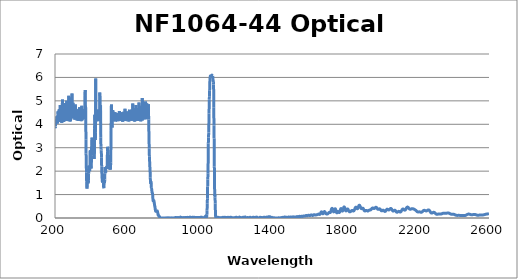
| Category | Optical Density |
|---|---|
| 2600.0 | 0.188 |
| 2599.0 | 0.186 |
| 2598.0 | 0.183 |
| 2597.0 | 0.181 |
| 2596.0 | 0.179 |
| 2595.0 | 0.178 |
| 2594.0 | 0.176 |
| 2593.0 | 0.175 |
| 2592.0 | 0.173 |
| 2591.0 | 0.172 |
| 2590.0 | 0.17 |
| 2589.0 | 0.169 |
| 2588.0 | 0.167 |
| 2587.0 | 0.166 |
| 2586.0 | 0.165 |
| 2585.0 | 0.164 |
| 2584.0 | 0.163 |
| 2583.0 | 0.162 |
| 2582.0 | 0.16 |
| 2581.0 | 0.158 |
| 2580.0 | 0.156 |
| 2579.0 | 0.154 |
| 2578.0 | 0.152 |
| 2577.0 | 0.15 |
| 2576.0 | 0.148 |
| 2575.0 | 0.145 |
| 2574.0 | 0.143 |
| 2573.0 | 0.141 |
| 2572.0 | 0.139 |
| 2571.0 | 0.137 |
| 2570.0 | 0.135 |
| 2569.0 | 0.133 |
| 2568.0 | 0.131 |
| 2567.0 | 0.13 |
| 2566.0 | 0.129 |
| 2565.0 | 0.128 |
| 2564.0 | 0.127 |
| 2563.0 | 0.127 |
| 2562.0 | 0.127 |
| 2561.0 | 0.127 |
| 2560.0 | 0.127 |
| 2559.0 | 0.127 |
| 2558.0 | 0.127 |
| 2557.0 | 0.127 |
| 2556.0 | 0.128 |
| 2555.0 | 0.128 |
| 2554.0 | 0.128 |
| 2553.0 | 0.128 |
| 2552.0 | 0.128 |
| 2551.0 | 0.128 |
| 2550.0 | 0.127 |
| 2549.0 | 0.127 |
| 2548.0 | 0.126 |
| 2547.0 | 0.124 |
| 2546.0 | 0.123 |
| 2545.0 | 0.122 |
| 2544.0 | 0.121 |
| 2543.0 | 0.12 |
| 2542.0 | 0.119 |
| 2541.0 | 0.118 |
| 2540.0 | 0.117 |
| 2539.0 | 0.117 |
| 2538.0 | 0.118 |
| 2537.0 | 0.118 |
| 2536.0 | 0.119 |
| 2535.0 | 0.12 |
| 2534.0 | 0.122 |
| 2533.0 | 0.124 |
| 2532.0 | 0.126 |
| 2531.0 | 0.128 |
| 2530.0 | 0.131 |
| 2529.0 | 0.134 |
| 2528.0 | 0.136 |
| 2527.0 | 0.139 |
| 2526.0 | 0.141 |
| 2525.0 | 0.144 |
| 2524.0 | 0.146 |
| 2523.0 | 0.148 |
| 2522.0 | 0.15 |
| 2521.0 | 0.151 |
| 2520.0 | 0.152 |
| 2519.0 | 0.153 |
| 2518.0 | 0.153 |
| 2517.0 | 0.153 |
| 2516.0 | 0.152 |
| 2515.0 | 0.151 |
| 2514.0 | 0.149 |
| 2513.0 | 0.148 |
| 2512.0 | 0.146 |
| 2511.0 | 0.144 |
| 2510.0 | 0.143 |
| 2509.0 | 0.141 |
| 2508.0 | 0.14 |
| 2507.0 | 0.139 |
| 2506.0 | 0.138 |
| 2505.0 | 0.137 |
| 2504.0 | 0.138 |
| 2503.0 | 0.138 |
| 2502.0 | 0.139 |
| 2501.0 | 0.141 |
| 2500.0 | 0.143 |
| 2499.0 | 0.145 |
| 2498.0 | 0.147 |
| 2497.0 | 0.15 |
| 2496.0 | 0.153 |
| 2495.0 | 0.155 |
| 2494.0 | 0.158 |
| 2493.0 | 0.161 |
| 2492.0 | 0.163 |
| 2491.0 | 0.165 |
| 2490.0 | 0.166 |
| 2489.0 | 0.167 |
| 2488.0 | 0.167 |
| 2487.0 | 0.167 |
| 2486.0 | 0.167 |
| 2485.0 | 0.165 |
| 2484.0 | 0.163 |
| 2483.0 | 0.161 |
| 2482.0 | 0.158 |
| 2481.0 | 0.155 |
| 2480.0 | 0.151 |
| 2479.0 | 0.147 |
| 2478.0 | 0.143 |
| 2477.0 | 0.139 |
| 2476.0 | 0.134 |
| 2475.0 | 0.13 |
| 2474.0 | 0.126 |
| 2473.0 | 0.122 |
| 2472.0 | 0.119 |
| 2471.0 | 0.115 |
| 2470.0 | 0.112 |
| 2469.0 | 0.11 |
| 2468.0 | 0.108 |
| 2467.0 | 0.106 |
| 2466.0 | 0.105 |
| 2465.0 | 0.104 |
| 2464.0 | 0.104 |
| 2463.0 | 0.103 |
| 2462.0 | 0.103 |
| 2461.0 | 0.103 |
| 2460.0 | 0.103 |
| 2459.0 | 0.103 |
| 2458.0 | 0.103 |
| 2457.0 | 0.103 |
| 2456.0 | 0.104 |
| 2455.0 | 0.104 |
| 2454.0 | 0.104 |
| 2453.0 | 0.104 |
| 2452.0 | 0.104 |
| 2451.0 | 0.104 |
| 2450.0 | 0.104 |
| 2449.0 | 0.104 |
| 2448.0 | 0.104 |
| 2447.0 | 0.105 |
| 2446.0 | 0.105 |
| 2445.0 | 0.106 |
| 2444.0 | 0.106 |
| 2443.0 | 0.107 |
| 2442.0 | 0.108 |
| 2441.0 | 0.108 |
| 2440.0 | 0.109 |
| 2439.0 | 0.11 |
| 2438.0 | 0.111 |
| 2437.0 | 0.112 |
| 2436.0 | 0.113 |
| 2435.0 | 0.113 |
| 2434.0 | 0.113 |
| 2433.0 | 0.114 |
| 2432.0 | 0.114 |
| 2431.0 | 0.113 |
| 2430.0 | 0.113 |
| 2429.0 | 0.113 |
| 2428.0 | 0.112 |
| 2427.0 | 0.112 |
| 2426.0 | 0.111 |
| 2425.0 | 0.111 |
| 2424.0 | 0.111 |
| 2423.0 | 0.111 |
| 2422.0 | 0.112 |
| 2421.0 | 0.113 |
| 2420.0 | 0.114 |
| 2419.0 | 0.116 |
| 2418.0 | 0.118 |
| 2417.0 | 0.12 |
| 2416.0 | 0.123 |
| 2415.0 | 0.126 |
| 2414.0 | 0.13 |
| 2413.0 | 0.133 |
| 2412.0 | 0.137 |
| 2411.0 | 0.14 |
| 2410.0 | 0.144 |
| 2409.0 | 0.147 |
| 2408.0 | 0.15 |
| 2407.0 | 0.153 |
| 2406.0 | 0.156 |
| 2405.0 | 0.158 |
| 2404.0 | 0.159 |
| 2403.0 | 0.161 |
| 2402.0 | 0.162 |
| 2401.0 | 0.162 |
| 2400.0 | 0.162 |
| 2399.0 | 0.162 |
| 2398.0 | 0.161 |
| 2397.0 | 0.16 |
| 2396.0 | 0.16 |
| 2395.0 | 0.16 |
| 2394.0 | 0.16 |
| 2393.0 | 0.16 |
| 2392.0 | 0.161 |
| 2391.0 | 0.162 |
| 2390.0 | 0.164 |
| 2389.0 | 0.166 |
| 2388.0 | 0.169 |
| 2387.0 | 0.172 |
| 2386.0 | 0.176 |
| 2385.0 | 0.18 |
| 2384.0 | 0.184 |
| 2383.0 | 0.189 |
| 2382.0 | 0.193 |
| 2381.0 | 0.197 |
| 2380.0 | 0.202 |
| 2379.0 | 0.205 |
| 2378.0 | 0.209 |
| 2377.0 | 0.211 |
| 2376.0 | 0.214 |
| 2375.0 | 0.215 |
| 2374.0 | 0.216 |
| 2373.0 | 0.216 |
| 2372.0 | 0.216 |
| 2371.0 | 0.215 |
| 2370.0 | 0.213 |
| 2369.0 | 0.212 |
| 2368.0 | 0.21 |
| 2367.0 | 0.208 |
| 2366.0 | 0.206 |
| 2365.0 | 0.203 |
| 2364.0 | 0.202 |
| 2363.0 | 0.2 |
| 2362.0 | 0.199 |
| 2361.0 | 0.198 |
| 2360.0 | 0.198 |
| 2359.0 | 0.198 |
| 2358.0 | 0.198 |
| 2357.0 | 0.198 |
| 2356.0 | 0.199 |
| 2355.0 | 0.201 |
| 2354.0 | 0.202 |
| 2353.0 | 0.203 |
| 2352.0 | 0.204 |
| 2351.0 | 0.205 |
| 2350.0 | 0.205 |
| 2349.0 | 0.205 |
| 2348.0 | 0.205 |
| 2347.0 | 0.203 |
| 2346.0 | 0.202 |
| 2345.0 | 0.199 |
| 2344.0 | 0.197 |
| 2343.0 | 0.193 |
| 2342.0 | 0.19 |
| 2341.0 | 0.187 |
| 2340.0 | 0.183 |
| 2339.0 | 0.18 |
| 2338.0 | 0.177 |
| 2337.0 | 0.174 |
| 2336.0 | 0.172 |
| 2335.0 | 0.17 |
| 2334.0 | 0.168 |
| 2333.0 | 0.168 |
| 2332.0 | 0.167 |
| 2331.0 | 0.168 |
| 2330.0 | 0.168 |
| 2329.0 | 0.169 |
| 2328.0 | 0.17 |
| 2327.0 | 0.171 |
| 2326.0 | 0.172 |
| 2325.0 | 0.173 |
| 2324.0 | 0.173 |
| 2323.0 | 0.173 |
| 2322.0 | 0.173 |
| 2321.0 | 0.172 |
| 2320.0 | 0.17 |
| 2319.0 | 0.168 |
| 2318.0 | 0.166 |
| 2317.0 | 0.164 |
| 2316.0 | 0.162 |
| 2315.0 | 0.16 |
| 2314.0 | 0.158 |
| 2313.0 | 0.157 |
| 2312.0 | 0.157 |
| 2311.0 | 0.157 |
| 2310.0 | 0.159 |
| 2309.0 | 0.162 |
| 2308.0 | 0.167 |
| 2307.0 | 0.172 |
| 2306.0 | 0.178 |
| 2305.0 | 0.185 |
| 2304.0 | 0.192 |
| 2303.0 | 0.2 |
| 2302.0 | 0.208 |
| 2301.0 | 0.216 |
| 2300.0 | 0.223 |
| 2299.0 | 0.23 |
| 2298.0 | 0.235 |
| 2297.0 | 0.239 |
| 2296.0 | 0.241 |
| 2295.0 | 0.243 |
| 2294.0 | 0.243 |
| 2293.0 | 0.242 |
| 2292.0 | 0.24 |
| 2291.0 | 0.236 |
| 2290.0 | 0.232 |
| 2289.0 | 0.228 |
| 2288.0 | 0.223 |
| 2287.0 | 0.218 |
| 2286.0 | 0.215 |
| 2285.0 | 0.212 |
| 2284.0 | 0.21 |
| 2283.0 | 0.21 |
| 2282.0 | 0.211 |
| 2281.0 | 0.215 |
| 2280.0 | 0.22 |
| 2279.0 | 0.227 |
| 2278.0 | 0.235 |
| 2277.0 | 0.245 |
| 2276.0 | 0.256 |
| 2275.0 | 0.268 |
| 2274.0 | 0.281 |
| 2273.0 | 0.293 |
| 2272.0 | 0.304 |
| 2271.0 | 0.315 |
| 2270.0 | 0.324 |
| 2269.0 | 0.331 |
| 2268.0 | 0.337 |
| 2267.0 | 0.341 |
| 2266.0 | 0.344 |
| 2265.0 | 0.345 |
| 2264.0 | 0.344 |
| 2263.0 | 0.341 |
| 2262.0 | 0.338 |
| 2261.0 | 0.333 |
| 2260.0 | 0.329 |
| 2259.0 | 0.323 |
| 2258.0 | 0.318 |
| 2257.0 | 0.313 |
| 2256.0 | 0.309 |
| 2255.0 | 0.306 |
| 2254.0 | 0.304 |
| 2253.0 | 0.302 |
| 2252.0 | 0.303 |
| 2251.0 | 0.304 |
| 2250.0 | 0.306 |
| 2249.0 | 0.309 |
| 2248.0 | 0.312 |
| 2247.0 | 0.316 |
| 2246.0 | 0.319 |
| 2245.0 | 0.323 |
| 2244.0 | 0.325 |
| 2243.0 | 0.327 |
| 2242.0 | 0.328 |
| 2241.0 | 0.328 |
| 2240.0 | 0.326 |
| 2239.0 | 0.323 |
| 2238.0 | 0.319 |
| 2237.0 | 0.313 |
| 2236.0 | 0.306 |
| 2235.0 | 0.298 |
| 2234.0 | 0.291 |
| 2233.0 | 0.283 |
| 2232.0 | 0.275 |
| 2231.0 | 0.267 |
| 2230.0 | 0.261 |
| 2229.0 | 0.256 |
| 2228.0 | 0.251 |
| 2227.0 | 0.248 |
| 2226.0 | 0.246 |
| 2225.0 | 0.245 |
| 2224.0 | 0.246 |
| 2223.0 | 0.247 |
| 2222.0 | 0.249 |
| 2221.0 | 0.252 |
| 2220.0 | 0.254 |
| 2219.0 | 0.257 |
| 2218.0 | 0.259 |
| 2217.0 | 0.261 |
| 2216.0 | 0.262 |
| 2215.0 | 0.262 |
| 2214.0 | 0.263 |
| 2213.0 | 0.262 |
| 2212.0 | 0.262 |
| 2211.0 | 0.261 |
| 2210.0 | 0.26 |
| 2209.0 | 0.259 |
| 2208.0 | 0.259 |
| 2207.0 | 0.26 |
| 2206.0 | 0.261 |
| 2205.0 | 0.263 |
| 2204.0 | 0.266 |
| 2203.0 | 0.271 |
| 2202.0 | 0.276 |
| 2201.0 | 0.282 |
| 2200.0 | 0.289 |
| 2199.0 | 0.296 |
| 2198.0 | 0.303 |
| 2197.0 | 0.311 |
| 2196.0 | 0.318 |
| 2195.0 | 0.326 |
| 2194.0 | 0.333 |
| 2193.0 | 0.339 |
| 2192.0 | 0.345 |
| 2191.0 | 0.35 |
| 2190.0 | 0.356 |
| 2189.0 | 0.36 |
| 2188.0 | 0.365 |
| 2187.0 | 0.369 |
| 2186.0 | 0.373 |
| 2185.0 | 0.376 |
| 2184.0 | 0.38 |
| 2183.0 | 0.383 |
| 2182.0 | 0.386 |
| 2181.0 | 0.389 |
| 2180.0 | 0.392 |
| 2179.0 | 0.394 |
| 2178.0 | 0.396 |
| 2177.0 | 0.397 |
| 2176.0 | 0.398 |
| 2175.0 | 0.397 |
| 2174.0 | 0.397 |
| 2173.0 | 0.395 |
| 2172.0 | 0.393 |
| 2171.0 | 0.39 |
| 2170.0 | 0.387 |
| 2169.0 | 0.383 |
| 2168.0 | 0.38 |
| 2167.0 | 0.377 |
| 2166.0 | 0.375 |
| 2165.0 | 0.373 |
| 2164.0 | 0.373 |
| 2163.0 | 0.374 |
| 2162.0 | 0.377 |
| 2161.0 | 0.382 |
| 2160.0 | 0.388 |
| 2159.0 | 0.395 |
| 2158.0 | 0.404 |
| 2157.0 | 0.414 |
| 2156.0 | 0.424 |
| 2155.0 | 0.434 |
| 2154.0 | 0.443 |
| 2153.0 | 0.451 |
| 2152.0 | 0.458 |
| 2151.0 | 0.463 |
| 2150.0 | 0.466 |
| 2149.0 | 0.466 |
| 2148.0 | 0.464 |
| 2147.0 | 0.459 |
| 2146.0 | 0.451 |
| 2145.0 | 0.442 |
| 2144.0 | 0.431 |
| 2143.0 | 0.418 |
| 2142.0 | 0.404 |
| 2141.0 | 0.39 |
| 2140.0 | 0.375 |
| 2139.0 | 0.363 |
| 2138.0 | 0.353 |
| 2137.0 | 0.344 |
| 2136.0 | 0.338 |
| 2135.0 | 0.335 |
| 2134.0 | 0.334 |
| 2133.0 | 0.336 |
| 2132.0 | 0.341 |
| 2131.0 | 0.347 |
| 2130.0 | 0.354 |
| 2129.0 | 0.362 |
| 2128.0 | 0.369 |
| 2127.0 | 0.376 |
| 2126.0 | 0.381 |
| 2125.0 | 0.384 |
| 2124.0 | 0.385 |
| 2123.0 | 0.383 |
| 2122.0 | 0.378 |
| 2121.0 | 0.371 |
| 2120.0 | 0.362 |
| 2119.0 | 0.35 |
| 2118.0 | 0.337 |
| 2117.0 | 0.322 |
| 2116.0 | 0.308 |
| 2115.0 | 0.294 |
| 2114.0 | 0.281 |
| 2113.0 | 0.27 |
| 2112.0 | 0.262 |
| 2111.0 | 0.257 |
| 2110.0 | 0.254 |
| 2109.0 | 0.255 |
| 2108.0 | 0.257 |
| 2107.0 | 0.261 |
| 2106.0 | 0.266 |
| 2105.0 | 0.272 |
| 2104.0 | 0.277 |
| 2103.0 | 0.28 |
| 2102.0 | 0.283 |
| 2101.0 | 0.284 |
| 2100.0 | 0.283 |
| 2099.0 | 0.28 |
| 2098.0 | 0.275 |
| 2097.0 | 0.27 |
| 2096.0 | 0.264 |
| 2095.0 | 0.258 |
| 2094.0 | 0.253 |
| 2093.0 | 0.249 |
| 2092.0 | 0.247 |
| 2091.0 | 0.246 |
| 2090.0 | 0.249 |
| 2089.0 | 0.253 |
| 2088.0 | 0.26 |
| 2087.0 | 0.268 |
| 2086.0 | 0.278 |
| 2085.0 | 0.289 |
| 2084.0 | 0.299 |
| 2083.0 | 0.309 |
| 2082.0 | 0.318 |
| 2081.0 | 0.324 |
| 2080.0 | 0.329 |
| 2079.0 | 0.331 |
| 2078.0 | 0.33 |
| 2077.0 | 0.328 |
| 2076.0 | 0.324 |
| 2075.0 | 0.318 |
| 2074.0 | 0.311 |
| 2073.0 | 0.305 |
| 2072.0 | 0.3 |
| 2071.0 | 0.296 |
| 2070.0 | 0.296 |
| 2069.0 | 0.298 |
| 2068.0 | 0.303 |
| 2067.0 | 0.311 |
| 2066.0 | 0.321 |
| 2065.0 | 0.333 |
| 2064.0 | 0.346 |
| 2063.0 | 0.36 |
| 2062.0 | 0.373 |
| 2061.0 | 0.384 |
| 2060.0 | 0.394 |
| 2059.0 | 0.401 |
| 2058.0 | 0.406 |
| 2057.0 | 0.407 |
| 2056.0 | 0.406 |
| 2055.0 | 0.403 |
| 2054.0 | 0.397 |
| 2053.0 | 0.39 |
| 2052.0 | 0.381 |
| 2051.0 | 0.373 |
| 2050.0 | 0.364 |
| 2049.0 | 0.356 |
| 2048.0 | 0.349 |
| 2047.0 | 0.345 |
| 2046.0 | 0.343 |
| 2045.0 | 0.344 |
| 2044.0 | 0.346 |
| 2043.0 | 0.351 |
| 2042.0 | 0.356 |
| 2041.0 | 0.362 |
| 2040.0 | 0.368 |
| 2039.0 | 0.373 |
| 2038.0 | 0.375 |
| 2037.0 | 0.376 |
| 2036.0 | 0.374 |
| 2035.0 | 0.37 |
| 2034.0 | 0.362 |
| 2033.0 | 0.353 |
| 2032.0 | 0.342 |
| 2031.0 | 0.33 |
| 2030.0 | 0.317 |
| 2029.0 | 0.305 |
| 2028.0 | 0.295 |
| 2027.0 | 0.288 |
| 2026.0 | 0.283 |
| 2025.0 | 0.281 |
| 2024.0 | 0.282 |
| 2023.0 | 0.286 |
| 2022.0 | 0.293 |
| 2021.0 | 0.3 |
| 2020.0 | 0.309 |
| 2019.0 | 0.316 |
| 2018.0 | 0.323 |
| 2017.0 | 0.329 |
| 2016.0 | 0.332 |
| 2015.0 | 0.333 |
| 2014.0 | 0.332 |
| 2013.0 | 0.329 |
| 2012.0 | 0.325 |
| 2011.0 | 0.319 |
| 2010.0 | 0.314 |
| 2009.0 | 0.31 |
| 2008.0 | 0.306 |
| 2007.0 | 0.305 |
| 2006.0 | 0.306 |
| 2005.0 | 0.309 |
| 2004.0 | 0.315 |
| 2003.0 | 0.323 |
| 2002.0 | 0.334 |
| 2001.0 | 0.345 |
| 2000.0 | 0.356 |
| 1999.0 | 0.367 |
| 1998.0 | 0.376 |
| 1997.0 | 0.384 |
| 1996.0 | 0.389 |
| 1995.0 | 0.391 |
| 1994.0 | 0.391 |
| 1993.0 | 0.389 |
| 1992.0 | 0.385 |
| 1991.0 | 0.38 |
| 1990.0 | 0.376 |
| 1989.0 | 0.372 |
| 1988.0 | 0.369 |
| 1987.0 | 0.369 |
| 1986.0 | 0.371 |
| 1985.0 | 0.376 |
| 1984.0 | 0.383 |
| 1983.0 | 0.393 |
| 1982.0 | 0.404 |
| 1981.0 | 0.415 |
| 1980.0 | 0.426 |
| 1979.0 | 0.436 |
| 1978.0 | 0.445 |
| 1977.0 | 0.452 |
| 1976.0 | 0.456 |
| 1975.0 | 0.457 |
| 1974.0 | 0.456 |
| 1973.0 | 0.453 |
| 1972.0 | 0.447 |
| 1971.0 | 0.441 |
| 1970.0 | 0.434 |
| 1969.0 | 0.425 |
| 1968.0 | 0.418 |
| 1967.0 | 0.412 |
| 1966.0 | 0.408 |
| 1965.0 | 0.406 |
| 1964.0 | 0.405 |
| 1963.0 | 0.408 |
| 1962.0 | 0.411 |
| 1961.0 | 0.415 |
| 1960.0 | 0.419 |
| 1959.0 | 0.423 |
| 1958.0 | 0.426 |
| 1957.0 | 0.428 |
| 1956.0 | 0.427 |
| 1955.0 | 0.424 |
| 1954.0 | 0.419 |
| 1953.0 | 0.412 |
| 1952.0 | 0.403 |
| 1951.0 | 0.393 |
| 1950.0 | 0.383 |
| 1949.0 | 0.373 |
| 1948.0 | 0.364 |
| 1947.0 | 0.356 |
| 1946.0 | 0.35 |
| 1945.0 | 0.346 |
| 1944.0 | 0.343 |
| 1943.0 | 0.342 |
| 1942.0 | 0.341 |
| 1941.0 | 0.34 |
| 1940.0 | 0.34 |
| 1939.0 | 0.339 |
| 1938.0 | 0.336 |
| 1937.0 | 0.333 |
| 1936.0 | 0.328 |
| 1935.0 | 0.323 |
| 1934.0 | 0.317 |
| 1933.0 | 0.311 |
| 1932.0 | 0.306 |
| 1931.0 | 0.302 |
| 1930.0 | 0.3 |
| 1929.0 | 0.3 |
| 1928.0 | 0.301 |
| 1927.0 | 0.304 |
| 1926.0 | 0.308 |
| 1925.0 | 0.312 |
| 1924.0 | 0.316 |
| 1923.0 | 0.319 |
| 1922.0 | 0.322 |
| 1921.0 | 0.323 |
| 1920.0 | 0.323 |
| 1919.0 | 0.32 |
| 1918.0 | 0.316 |
| 1917.0 | 0.311 |
| 1916.0 | 0.305 |
| 1915.0 | 0.301 |
| 1914.0 | 0.3 |
| 1913.0 | 0.302 |
| 1912.0 | 0.307 |
| 1911.0 | 0.314 |
| 1910.0 | 0.323 |
| 1909.0 | 0.334 |
| 1908.0 | 0.347 |
| 1907.0 | 0.364 |
| 1906.0 | 0.382 |
| 1905.0 | 0.398 |
| 1904.0 | 0.409 |
| 1903.0 | 0.416 |
| 1902.0 | 0.419 |
| 1901.0 | 0.42 |
| 1900.0 | 0.417 |
| 1899.0 | 0.414 |
| 1898.0 | 0.41 |
| 1897.0 | 0.405 |
| 1896.0 | 0.401 |
| 1895.0 | 0.399 |
| 1894.0 | 0.401 |
| 1893.0 | 0.408 |
| 1892.0 | 0.421 |
| 1891.0 | 0.437 |
| 1890.0 | 0.454 |
| 1889.0 | 0.473 |
| 1888.0 | 0.49 |
| 1887.0 | 0.506 |
| 1886.0 | 0.52 |
| 1885.0 | 0.533 |
| 1884.0 | 0.542 |
| 1883.0 | 0.545 |
| 1882.0 | 0.542 |
| 1881.0 | 0.533 |
| 1880.0 | 0.519 |
| 1879.0 | 0.501 |
| 1878.0 | 0.479 |
| 1877.0 | 0.457 |
| 1876.0 | 0.437 |
| 1875.0 | 0.418 |
| 1874.0 | 0.404 |
| 1873.0 | 0.397 |
| 1872.0 | 0.394 |
| 1871.0 | 0.397 |
| 1870.0 | 0.407 |
| 1869.0 | 0.419 |
| 1868.0 | 0.433 |
| 1867.0 | 0.444 |
| 1866.0 | 0.454 |
| 1865.0 | 0.46 |
| 1864.0 | 0.462 |
| 1863.0 | 0.461 |
| 1862.0 | 0.455 |
| 1861.0 | 0.444 |
| 1860.0 | 0.43 |
| 1859.0 | 0.411 |
| 1858.0 | 0.392 |
| 1857.0 | 0.372 |
| 1856.0 | 0.352 |
| 1855.0 | 0.335 |
| 1854.0 | 0.32 |
| 1853.0 | 0.31 |
| 1852.0 | 0.303 |
| 1851.0 | 0.3 |
| 1850.0 | 0.3 |
| 1849.0 | 0.303 |
| 1848.0 | 0.31 |
| 1847.0 | 0.317 |
| 1846.0 | 0.322 |
| 1845.0 | 0.324 |
| 1844.0 | 0.323 |
| 1843.0 | 0.321 |
| 1842.0 | 0.318 |
| 1841.0 | 0.317 |
| 1840.0 | 0.313 |
| 1839.0 | 0.307 |
| 1838.0 | 0.301 |
| 1837.0 | 0.293 |
| 1836.0 | 0.286 |
| 1835.0 | 0.28 |
| 1834.0 | 0.274 |
| 1833.0 | 0.269 |
| 1832.0 | 0.264 |
| 1831.0 | 0.262 |
| 1830.0 | 0.261 |
| 1829.0 | 0.263 |
| 1828.0 | 0.268 |
| 1827.0 | 0.277 |
| 1826.0 | 0.288 |
| 1825.0 | 0.3 |
| 1824.0 | 0.313 |
| 1823.0 | 0.327 |
| 1822.0 | 0.344 |
| 1821.0 | 0.361 |
| 1820.0 | 0.376 |
| 1819.0 | 0.384 |
| 1818.0 | 0.386 |
| 1817.0 | 0.384 |
| 1816.0 | 0.378 |
| 1815.0 | 0.368 |
| 1814.0 | 0.356 |
| 1813.0 | 0.342 |
| 1812.0 | 0.327 |
| 1811.0 | 0.314 |
| 1810.0 | 0.305 |
| 1809.0 | 0.303 |
| 1808.0 | 0.308 |
| 1807.0 | 0.32 |
| 1806.0 | 0.34 |
| 1805.0 | 0.364 |
| 1804.0 | 0.391 |
| 1803.0 | 0.417 |
| 1802.0 | 0.44 |
| 1801.0 | 0.458 |
| 1800.0 | 0.471 |
| 1799.0 | 0.475 |
| 1798.0 | 0.47 |
| 1797.0 | 0.457 |
| 1796.0 | 0.437 |
| 1795.0 | 0.411 |
| 1794.0 | 0.381 |
| 1793.0 | 0.352 |
| 1792.0 | 0.325 |
| 1791.0 | 0.305 |
| 1790.0 | 0.295 |
| 1789.0 | 0.294 |
| 1788.0 | 0.304 |
| 1787.0 | 0.32 |
| 1786.0 | 0.341 |
| 1785.0 | 0.362 |
| 1784.0 | 0.382 |
| 1783.0 | 0.395 |
| 1782.0 | 0.402 |
| 1781.0 | 0.4 |
| 1780.0 | 0.39 |
| 1779.0 | 0.374 |
| 1778.0 | 0.351 |
| 1777.0 | 0.326 |
| 1776.0 | 0.299 |
| 1775.0 | 0.273 |
| 1774.0 | 0.253 |
| 1773.0 | 0.239 |
| 1772.0 | 0.232 |
| 1771.0 | 0.232 |
| 1770.0 | 0.238 |
| 1769.0 | 0.248 |
| 1768.0 | 0.259 |
| 1767.0 | 0.268 |
| 1766.0 | 0.274 |
| 1765.0 | 0.275 |
| 1764.0 | 0.27 |
| 1763.0 | 0.259 |
| 1762.0 | 0.247 |
| 1761.0 | 0.234 |
| 1760.0 | 0.224 |
| 1759.0 | 0.22 |
| 1758.0 | 0.224 |
| 1757.0 | 0.237 |
| 1756.0 | 0.258 |
| 1755.0 | 0.285 |
| 1754.0 | 0.314 |
| 1753.0 | 0.342 |
| 1752.0 | 0.367 |
| 1751.0 | 0.384 |
| 1750.0 | 0.393 |
| 1749.0 | 0.393 |
| 1748.0 | 0.384 |
| 1747.0 | 0.368 |
| 1746.0 | 0.345 |
| 1745.0 | 0.32 |
| 1744.0 | 0.295 |
| 1743.0 | 0.275 |
| 1742.0 | 0.263 |
| 1741.0 | 0.26 |
| 1740.0 | 0.268 |
| 1739.0 | 0.285 |
| 1738.0 | 0.309 |
| 1737.0 | 0.335 |
| 1736.0 | 0.361 |
| 1735.0 | 0.383 |
| 1734.0 | 0.4 |
| 1733.0 | 0.41 |
| 1732.0 | 0.412 |
| 1731.0 | 0.406 |
| 1730.0 | 0.393 |
| 1729.0 | 0.373 |
| 1728.0 | 0.349 |
| 1727.0 | 0.323 |
| 1726.0 | 0.296 |
| 1725.0 | 0.273 |
| 1724.0 | 0.253 |
| 1723.0 | 0.24 |
| 1722.0 | 0.232 |
| 1721.0 | 0.229 |
| 1720.0 | 0.23 |
| 1719.0 | 0.233 |
| 1718.0 | 0.236 |
| 1717.0 | 0.238 |
| 1716.0 | 0.236 |
| 1715.0 | 0.232 |
| 1714.0 | 0.224 |
| 1713.0 | 0.216 |
| 1712.0 | 0.206 |
| 1711.0 | 0.197 |
| 1710.0 | 0.189 |
| 1709.0 | 0.182 |
| 1708.0 | 0.178 |
| 1707.0 | 0.175 |
| 1706.0 | 0.174 |
| 1705.0 | 0.173 |
| 1704.0 | 0.172 |
| 1703.0 | 0.172 |
| 1702.0 | 0.172 |
| 1701.0 | 0.173 |
| 1700.0 | 0.176 |
| 1699.0 | 0.182 |
| 1698.0 | 0.19 |
| 1697.0 | 0.201 |
| 1696.0 | 0.215 |
| 1695.0 | 0.229 |
| 1694.0 | 0.244 |
| 1693.0 | 0.257 |
| 1692.0 | 0.267 |
| 1691.0 | 0.273 |
| 1690.0 | 0.274 |
| 1689.0 | 0.27 |
| 1688.0 | 0.261 |
| 1687.0 | 0.247 |
| 1686.0 | 0.231 |
| 1685.0 | 0.214 |
| 1684.0 | 0.199 |
| 1683.0 | 0.188 |
| 1682.0 | 0.182 |
| 1681.0 | 0.183 |
| 1680.0 | 0.191 |
| 1679.0 | 0.203 |
| 1678.0 | 0.219 |
| 1677.0 | 0.235 |
| 1676.0 | 0.249 |
| 1675.0 | 0.258 |
| 1674.0 | 0.262 |
| 1673.0 | 0.261 |
| 1672.0 | 0.253 |
| 1671.0 | 0.241 |
| 1670.0 | 0.225 |
| 1669.0 | 0.207 |
| 1668.0 | 0.189 |
| 1667.0 | 0.175 |
| 1666.0 | 0.163 |
| 1665.0 | 0.156 |
| 1664.0 | 0.153 |
| 1663.0 | 0.154 |
| 1662.0 | 0.157 |
| 1661.0 | 0.16 |
| 1660.0 | 0.164 |
| 1659.0 | 0.166 |
| 1658.0 | 0.166 |
| 1657.0 | 0.165 |
| 1656.0 | 0.162 |
| 1655.0 | 0.158 |
| 1654.0 | 0.154 |
| 1653.0 | 0.15 |
| 1652.0 | 0.146 |
| 1651.0 | 0.143 |
| 1650.0 | 0.142 |
| 1649.0 | 0.14 |
| 1648.0 | 0.14 |
| 1647.0 | 0.138 |
| 1646.0 | 0.137 |
| 1645.0 | 0.135 |
| 1644.0 | 0.132 |
| 1643.0 | 0.129 |
| 1642.0 | 0.127 |
| 1641.0 | 0.125 |
| 1640.0 | 0.125 |
| 1639.0 | 0.126 |
| 1638.0 | 0.128 |
| 1637.0 | 0.132 |
| 1636.0 | 0.136 |
| 1635.0 | 0.14 |
| 1634.0 | 0.142 |
| 1633.0 | 0.143 |
| 1632.0 | 0.141 |
| 1631.0 | 0.138 |
| 1630.0 | 0.132 |
| 1629.0 | 0.126 |
| 1628.0 | 0.12 |
| 1627.0 | 0.114 |
| 1626.0 | 0.11 |
| 1625.0 | 0.108 |
| 1624.0 | 0.109 |
| 1623.0 | 0.112 |
| 1622.0 | 0.117 |
| 1621.0 | 0.122 |
| 1620.0 | 0.127 |
| 1619.0 | 0.131 |
| 1618.0 | 0.133 |
| 1617.0 | 0.133 |
| 1616.0 | 0.131 |
| 1615.0 | 0.127 |
| 1614.0 | 0.122 |
| 1613.0 | 0.116 |
| 1612.0 | 0.11 |
| 1611.0 | 0.106 |
| 1610.0 | 0.104 |
| 1609.0 | 0.103 |
| 1608.0 | 0.105 |
| 1607.0 | 0.108 |
| 1606.0 | 0.111 |
| 1605.0 | 0.115 |
| 1604.0 | 0.118 |
| 1603.0 | 0.12 |
| 1602.0 | 0.119 |
| 1601.0 | 0.117 |
| 1600.0 | 0.113 |
| 1599.0 | 0.107 |
| 1598.0 | 0.103 |
| 1597.0 | 0.098 |
| 1596.0 | 0.096 |
| 1595.0 | 0.095 |
| 1594.0 | 0.096 |
| 1593.0 | 0.099 |
| 1592.0 | 0.103 |
| 1591.0 | 0.106 |
| 1590.0 | 0.108 |
| 1589.0 | 0.108 |
| 1588.0 | 0.106 |
| 1587.0 | 0.103 |
| 1586.0 | 0.098 |
| 1585.0 | 0.093 |
| 1584.0 | 0.088 |
| 1583.0 | 0.085 |
| 1582.0 | 0.083 |
| 1581.0 | 0.083 |
| 1580.0 | 0.085 |
| 1579.0 | 0.087 |
| 1578.0 | 0.089 |
| 1577.0 | 0.09 |
| 1576.0 | 0.09 |
| 1575.0 | 0.088 |
| 1574.0 | 0.084 |
| 1573.0 | 0.08 |
| 1572.0 | 0.075 |
| 1571.0 | 0.071 |
| 1570.0 | 0.069 |
| 1569.0 | 0.068 |
| 1568.0 | 0.069 |
| 1567.0 | 0.071 |
| 1566.0 | 0.073 |
| 1565.0 | 0.076 |
| 1564.0 | 0.077 |
| 1563.0 | 0.076 |
| 1562.0 | 0.073 |
| 1561.0 | 0.069 |
| 1560.0 | 0.064 |
| 1559.0 | 0.059 |
| 1558.0 | 0.056 |
| 1557.0 | 0.055 |
| 1556.0 | 0.056 |
| 1555.0 | 0.06 |
| 1554.0 | 0.064 |
| 1553.0 | 0.068 |
| 1552.0 | 0.071 |
| 1551.0 | 0.071 |
| 1550.0 | 0.069 |
| 1549.0 | 0.065 |
| 1548.0 | 0.06 |
| 1547.0 | 0.054 |
| 1546.0 | 0.05 |
| 1545.0 | 0.047 |
| 1544.0 | 0.047 |
| 1543.0 | 0.049 |
| 1542.0 | 0.052 |
| 1541.0 | 0.056 |
| 1540.0 | 0.059 |
| 1539.0 | 0.06 |
| 1538.0 | 0.059 |
| 1537.0 | 0.056 |
| 1536.0 | 0.052 |
| 1535.0 | 0.047 |
| 1534.0 | 0.042 |
| 1533.0 | 0.039 |
| 1532.0 | 0.038 |
| 1531.0 | 0.039 |
| 1530.0 | 0.04 |
| 1529.0 | 0.042 |
| 1528.0 | 0.044 |
| 1527.0 | 0.044 |
| 1526.0 | 0.044 |
| 1525.0 | 0.042 |
| 1524.0 | 0.04 |
| 1523.0 | 0.038 |
| 1522.0 | 0.038 |
| 1521.0 | 0.039 |
| 1520.0 | 0.041 |
| 1519.0 | 0.045 |
| 1518.0 | 0.048 |
| 1517.0 | 0.05 |
| 1516.0 | 0.049 |
| 1515.0 | 0.046 |
| 1514.0 | 0.042 |
| 1513.0 | 0.035 |
| 1512.0 | 0.03 |
| 1511.0 | 0.027 |
| 1510.0 | 0.026 |
| 1509.0 | 0.029 |
| 1508.0 | 0.033 |
| 1507.0 | 0.039 |
| 1506.0 | 0.043 |
| 1505.0 | 0.045 |
| 1504.0 | 0.045 |
| 1503.0 | 0.041 |
| 1502.0 | 0.036 |
| 1501.0 | 0.03 |
| 1500.0 | 0.024 |
| 1499.0 | 0.021 |
| 1498.0 | 0.022 |
| 1497.0 | 0.025 |
| 1496.0 | 0.03 |
| 1495.0 | 0.036 |
| 1494.0 | 0.04 |
| 1493.0 | 0.042 |
| 1492.0 | 0.041 |
| 1491.0 | 0.037 |
| 1490.0 | 0.031 |
| 1489.0 | 0.025 |
| 1488.0 | 0.02 |
| 1487.0 | 0.017 |
| 1486.0 | 0.017 |
| 1485.0 | 0.021 |
| 1484.0 | 0.026 |
| 1483.0 | 0.031 |
| 1482.0 | 0.035 |
| 1481.0 | 0.035 |
| 1480.0 | 0.032 |
| 1479.0 | 0.027 |
| 1478.0 | 0.021 |
| 1477.0 | 0.016 |
| 1476.0 | 0.013 |
| 1475.0 | 0.015 |
| 1474.0 | 0.021 |
| 1473.0 | 0.028 |
| 1472.0 | 0.036 |
| 1471.0 | 0.043 |
| 1470.0 | 0.046 |
| 1469.0 | 0.045 |
| 1468.0 | 0.039 |
| 1467.0 | 0.031 |
| 1466.0 | 0.023 |
| 1465.0 | 0.016 |
| 1464.0 | 0.012 |
| 1463.0 | 0.01 |
| 1462.0 | 0.013 |
| 1461.0 | 0.016 |
| 1460.0 | 0.021 |
| 1459.0 | 0.025 |
| 1458.0 | 0.027 |
| 1457.0 | 0.027 |
| 1456.0 | 0.025 |
| 1455.0 | 0.021 |
| 1454.0 | 0.017 |
| 1453.0 | 0.014 |
| 1452.0 | 0.011 |
| 1451.0 | 0.01 |
| 1450.0 | 0.01 |
| 1449.0 | 0.01 |
| 1448.0 | 0.011 |
| 1447.0 | 0.012 |
| 1446.0 | 0.011 |
| 1445.0 | 0.01 |
| 1444.0 | 0.009 |
| 1443.0 | 0.007 |
| 1442.0 | 0.006 |
| 1441.0 | 0.005 |
| 1440.0 | 0.005 |
| 1439.0 | 0.005 |
| 1438.0 | 0.006 |
| 1437.0 | 0.006 |
| 1436.0 | 0.006 |
| 1435.0 | 0.006 |
| 1434.0 | 0.005 |
| 1433.0 | 0.005 |
| 1432.0 | 0.005 |
| 1431.0 | 0.005 |
| 1430.0 | 0.005 |
| 1429.0 | 0.005 |
| 1428.0 | 0.005 |
| 1427.0 | 0.005 |
| 1426.0 | 0.005 |
| 1425.0 | 0.004 |
| 1424.0 | 0.004 |
| 1423.0 | 0.004 |
| 1422.0 | 0.004 |
| 1421.0 | 0.004 |
| 1420.0 | 0.004 |
| 1419.0 | 0.005 |
| 1418.0 | 0.005 |
| 1417.0 | 0.005 |
| 1416.0 | 0.005 |
| 1415.0 | 0.005 |
| 1414.0 | 0.006 |
| 1413.0 | 0.006 |
| 1412.0 | 0.007 |
| 1411.0 | 0.007 |
| 1410.0 | 0.008 |
| 1409.0 | 0.007 |
| 1408.0 | 0.007 |
| 1407.0 | 0.007 |
| 1406.0 | 0.007 |
| 1405.0 | 0.007 |
| 1404.0 | 0.007 |
| 1403.0 | 0.007 |
| 1402.0 | 0.008 |
| 1401.0 | 0.009 |
| 1400.0 | 0.022 |
| 1399.0 | 0.026 |
| 1398.0 | 0.002 |
| 1397.0 | 0.003 |
| 1396.0 | 0.009 |
| 1395.0 | 0.02 |
| 1394.0 | 0.022 |
| 1393.0 | 0 |
| 1392.0 | 0.01 |
| 1391.0 | 0.005 |
| 1390.0 | 0.028 |
| 1389.0 | 0.05 |
| 1388.0 | 0.057 |
| 1387.0 | 0.049 |
| 1386.0 | 0.028 |
| 1385.0 | 0.004 |
| 1384.0 | 0.001 |
| 1383.0 | 0.008 |
| 1382.0 | 0.03 |
| 1381.0 | 0.056 |
| 1380.0 | 0.031 |
| 1379.0 | 0.018 |
| 1378.0 | 0.012 |
| 1377.0 | 0.002 |
| 1376.0 | 0.001 |
| 1375.0 | 0.004 |
| 1374.0 | 0.014 |
| 1373.0 | 0.026 |
| 1372.0 | 0.039 |
| 1371.0 | 0.034 |
| 1370.0 | 0.027 |
| 1369.0 | 0.022 |
| 1368.0 | 0.005 |
| 1367.0 | 0.017 |
| 1366.0 | 0.01 |
| 1365.0 | 0.012 |
| 1364.0 | 0.007 |
| 1363.0 | 0.006 |
| 1362.0 | 0.013 |
| 1361.0 | 0.009 |
| 1360.0 | 0.03 |
| 1359.0 | 0.028 |
| 1358.0 | 0.012 |
| 1357.0 | 0.018 |
| 1356.0 | 0.015 |
| 1355.0 | 0.013 |
| 1354.0 | 0.026 |
| 1353.0 | 0.022 |
| 1352.0 | 0.005 |
| 1351.0 | 0.001 |
| 1350.0 | 0.002 |
| 1349.0 | 0.003 |
| 1348.0 | 0.003 |
| 1347.0 | 0.001 |
| 1346.0 | 0.003 |
| 1345.0 | 0 |
| 1344.0 | 0.007 |
| 1343.0 | 0.026 |
| 1342.0 | 0.001 |
| 1341.0 | 0 |
| 1340.0 | 0.002 |
| 1339.0 | 0.007 |
| 1338.0 | 0.002 |
| 1337.0 | 0 |
| 1336.0 | 0.027 |
| 1335.0 | 0.032 |
| 1334.0 | 0.034 |
| 1333.0 | 0.029 |
| 1332.0 | 0.001 |
| 1331.0 | 0.013 |
| 1330.0 | 0.015 |
| 1329.0 | 0.005 |
| 1328.0 | 0.01 |
| 1327.0 | 0 |
| 1326.0 | 0.002 |
| 1325.0 | 0.005 |
| 1324.0 | 0.001 |
| 1323.0 | 0.002 |
| 1322.0 | 0.003 |
| 1321.0 | 0.007 |
| 1320.0 | 0.001 |
| 1319.0 | 0.006 |
| 1318.0 | 0.015 |
| 1317.0 | 0.033 |
| 1316.0 | 0.038 |
| 1315.0 | 0.031 |
| 1314.0 | 0.016 |
| 1313.0 | 0.003 |
| 1312.0 | 0.008 |
| 1311.0 | 0.005 |
| 1310.0 | 0.001 |
| 1309.0 | 0.006 |
| 1308.0 | 0.025 |
| 1307.0 | 0.027 |
| 1306.0 | 0.002 |
| 1305.0 | 0.005 |
| 1304.0 | 0.002 |
| 1303.0 | 0.004 |
| 1302.0 | 0.002 |
| 1301.0 | 0.001 |
| 1300.0 | 0.001 |
| 1299.0 | 0.025 |
| 1298.0 | 0.033 |
| 1297.0 | 0.023 |
| 1296.0 | 0.004 |
| 1295.0 | 0.008 |
| 1294.0 | 0.007 |
| 1293.0 | 0.005 |
| 1292.0 | 0.005 |
| 1291.0 | 0.026 |
| 1290.0 | 0.023 |
| 1289.0 | 0.001 |
| 1288.0 | 0.011 |
| 1287.0 | 0.007 |
| 1286.0 | 0.001 |
| 1285.0 | 0.006 |
| 1284.0 | 0.003 |
| 1283.0 | 0.006 |
| 1282.0 | 0.01 |
| 1281.0 | 0.003 |
| 1280.0 | 0.015 |
| 1279.0 | 0.032 |
| 1278.0 | 0.029 |
| 1277.0 | 0.02 |
| 1276.0 | 0.002 |
| 1275.0 | 0.005 |
| 1274.0 | 0.005 |
| 1273.0 | 0.003 |
| 1272.0 | 0.009 |
| 1271.0 | 0.003 |
| 1270.0 | 0.004 |
| 1269.0 | 0.002 |
| 1268.0 | 0.009 |
| 1267.0 | 0.006 |
| 1266.0 | 0.014 |
| 1265.0 | 0.023 |
| 1264.0 | 0.006 |
| 1263.0 | 0.007 |
| 1262.0 | 0.001 |
| 1261.0 | 0.007 |
| 1260.0 | 0.006 |
| 1259.0 | 0.001 |
| 1258.0 | 0.002 |
| 1257.0 | 0.002 |
| 1256.0 | 0.002 |
| 1255.0 | 0 |
| 1254.0 | 0.007 |
| 1253.0 | 0.02 |
| 1252.0 | 0.042 |
| 1251.0 | 0.041 |
| 1250.0 | 0.019 |
| 1249.0 | 0.007 |
| 1248.0 | 0.008 |
| 1247.0 | 0.003 |
| 1246.0 | 0 |
| 1245.0 | 0.001 |
| 1244.0 | 0 |
| 1243.0 | 0.002 |
| 1242.0 | 0.01 |
| 1241.0 | 0.029 |
| 1240.0 | 0.034 |
| 1239.0 | 0.022 |
| 1238.0 | 0.001 |
| 1237.0 | 0.004 |
| 1236.0 | 0.006 |
| 1235.0 | 0.009 |
| 1234.0 | 0.009 |
| 1233.0 | 0.003 |
| 1232.0 | 0.007 |
| 1231.0 | 0.009 |
| 1230.0 | 0.008 |
| 1229.0 | 0.005 |
| 1228.0 | 0.014 |
| 1227.0 | 0.026 |
| 1226.0 | 0.015 |
| 1225.0 | 0.004 |
| 1224.0 | 0.005 |
| 1223.0 | 0.004 |
| 1222.0 | 0.008 |
| 1221.0 | 0.029 |
| 1220.0 | 0.038 |
| 1219.0 | 0.019 |
| 1218.0 | 0 |
| 1217.0 | 0.002 |
| 1216.0 | 0.005 |
| 1215.0 | 0.001 |
| 1214.0 | 0 |
| 1213.0 | 0.003 |
| 1212.0 | 0.001 |
| 1211.0 | 0.002 |
| 1210.0 | 0.014 |
| 1209.0 | 0.005 |
| 1208.0 | 0.019 |
| 1207.0 | 0.016 |
| 1206.0 | 0.011 |
| 1205.0 | 0.009 |
| 1204.0 | 0.03 |
| 1203.0 | 0.024 |
| 1202.0 | 0.005 |
| 1201.0 | 0.002 |
| 1200.0 | 0.006 |
| 1199.0 | 0.013 |
| 1198.0 | 0.03 |
| 1197.0 | 0.014 |
| 1196.0 | 0.003 |
| 1195.0 | 0.001 |
| 1194.0 | 0.001 |
| 1193.0 | 0.002 |
| 1192.0 | 0.003 |
| 1191.0 | 0 |
| 1190.0 | 0.013 |
| 1189.0 | 0.014 |
| 1188.0 | 0.004 |
| 1187.0 | 0.009 |
| 1186.0 | 0.016 |
| 1185.0 | 0.01 |
| 1184.0 | 0.007 |
| 1183.0 | 0.008 |
| 1182.0 | 0.013 |
| 1181.0 | 0.011 |
| 1180.0 | 0.005 |
| 1179.0 | 0.005 |
| 1178.0 | 0.006 |
| 1177.0 | 0.01 |
| 1176.0 | 0.026 |
| 1175.0 | 0.025 |
| 1174.0 | 0.018 |
| 1173.0 | 0.017 |
| 1172.0 | 0.008 |
| 1171.0 | 0.018 |
| 1170.0 | 0.03 |
| 1169.0 | 0.03 |
| 1168.0 | 0.025 |
| 1167.0 | 0.02 |
| 1166.0 | 0.018 |
| 1165.0 | 0.013 |
| 1164.0 | 0.018 |
| 1163.0 | 0.023 |
| 1162.0 | 0.017 |
| 1161.0 | 0.01 |
| 1160.0 | 0.005 |
| 1159.0 | 0.005 |
| 1158.0 | 0.015 |
| 1157.0 | 0.031 |
| 1156.0 | 0.02 |
| 1155.0 | 0.013 |
| 1154.0 | 0.008 |
| 1153.0 | 0.019 |
| 1152.0 | 0.025 |
| 1151.0 | 0.023 |
| 1150.0 | 0.02 |
| 1149.0 | 0.02 |
| 1148.0 | 0.021 |
| 1147.0 | 0.015 |
| 1146.0 | 0.008 |
| 1145.0 | 0.023 |
| 1144.0 | 0.02 |
| 1143.0 | 0.017 |
| 1142.0 | 0.018 |
| 1141.0 | 0.014 |
| 1140.0 | 0.033 |
| 1139.0 | 0.027 |
| 1138.0 | 0.021 |
| 1137.0 | 0.012 |
| 1136.0 | 0.009 |
| 1135.0 | 0.001 |
| 1134.0 | 0.011 |
| 1133.0 | 0.012 |
| 1132.0 | 0.01 |
| 1131.0 | 0.011 |
| 1130.0 | 0.02 |
| 1129.0 | 0.03 |
| 1128.0 | 0.001 |
| 1127.0 | 0.019 |
| 1126.0 | 0.026 |
| 1125.0 | 0.02 |
| 1124.0 | 0.01 |
| 1123.0 | 0.01 |
| 1122.0 | 0.01 |
| 1121.0 | 0.008 |
| 1120.0 | 0.008 |
| 1119.0 | 0.014 |
| 1118.0 | 0.017 |
| 1117.0 | 0.014 |
| 1116.0 | 0.012 |
| 1115.0 | 0.005 |
| 1114.0 | 0.001 |
| 1113.0 | 0.004 |
| 1112.0 | 0.009 |
| 1111.0 | 0.015 |
| 1110.0 | 0.014 |
| 1109.0 | 0.008 |
| 1108.0 | 0.017 |
| 1107.0 | 0.018 |
| 1106.0 | 0.022 |
| 1105.0 | 0.026 |
| 1104.0 | 0.027 |
| 1103.0 | 0.023 |
| 1102.0 | 0.012 |
| 1101.0 | 0.009 |
| 1100.0 | 0.004 |
| 1099.0 | 0.023 |
| 1098.0 | 0.032 |
| 1097.0 | 0.001 |
| 1096.0 | 0.021 |
| 1095.0 | 0.019 |
| 1094.0 | 0.011 |
| 1093.0 | 0.009 |
| 1092.0 | 0.008 |
| 1091.0 | 0.003 |
| 1090.0 | 0.004 |
| 1089.0 | 0.018 |
| 1088.0 | 0.087 |
| 1087.0 | 0.299 |
| 1086.0 | 0.624 |
| 1085.0 | 0.884 |
| 1084.0 | 0.979 |
| 1083.0 | 0.942 |
| 1082.0 | 2.007 |
| 1081.0 | 2.206 |
| 1080.0 | 3.391 |
| 1079.0 | 3.952 |
| 1078.0 | 4.703 |
| 1077.0 | 5.699 |
| 1076.0 | 5.8 |
| 1075.0 | 5.854 |
| 1074.0 | 5.881 |
| 1073.0 | 5.952 |
| 1072.0 | 6.062 |
| 1071.0 | 6.047 |
| 1070.0 | 6.049 |
| 1069.0 | 6.072 |
| 1068.0 | 6.099 |
| 1067.0 | 6.046 |
| 1066.0 | 6.071 |
| 1065.0 | 6.022 |
| 1064.0 | 6.103 |
| 1063.0 | 6.073 |
| 1062.0 | 6.024 |
| 1061.0 | 6.096 |
| 1060.0 | 6.05 |
| 1059.0 | 6.057 |
| 1058.0 | 6.036 |
| 1057.0 | 6.01 |
| 1056.0 | 5.675 |
| 1055.0 | 5.45 |
| 1054.0 | 5.179 |
| 1053.0 | 5.05 |
| 1052.0 | 4.465 |
| 1051.0 | 4.054 |
| 1050.0 | 3.646 |
| 1049.0 | 3.441 |
| 1048.0 | 3.183 |
| 1047.0 | 2.431 |
| 1046.0 | 1.908 |
| 1045.0 | 1.643 |
| 1044.0 | 1.349 |
| 1043.0 | 0.844 |
| 1042.0 | 0.629 |
| 1041.0 | 0.328 |
| 1040.0 | 0.161 |
| 1039.0 | 0.067 |
| 1038.0 | 0.042 |
| 1037.0 | 0.071 |
| 1036.0 | 0.102 |
| 1035.0 | 0.095 |
| 1034.0 | 0.047 |
| 1033.0 | 0.037 |
| 1032.0 | 0.032 |
| 1031.0 | 0.066 |
| 1030.0 | 0.039 |
| 1029.0 | 0.026 |
| 1028.0 | 0.015 |
| 1027.0 | 0.013 |
| 1026.0 | 0.013 |
| 1025.0 | 0.021 |
| 1024.0 | 0.018 |
| 1023.0 | 0.016 |
| 1022.0 | 0.014 |
| 1021.0 | 0.011 |
| 1020.0 | 0.016 |
| 1019.0 | 0.01 |
| 1018.0 | 0.009 |
| 1017.0 | 0.016 |
| 1016.0 | 0.007 |
| 1015.0 | 0.018 |
| 1014.0 | 0.008 |
| 1013.0 | 0.007 |
| 1012.0 | 0.016 |
| 1011.0 | 0.036 |
| 1010.0 | 0.008 |
| 1009.0 | 0.005 |
| 1008.0 | 0.003 |
| 1007.0 | 0.002 |
| 1006.0 | 0.001 |
| 1005.0 | 0.032 |
| 1004.0 | 0.008 |
| 1003.0 | 0.003 |
| 1002.0 | 0.002 |
| 1001.0 | 0.003 |
| 1000.0 | 0.004 |
| 999.0 | 0.018 |
| 998.0 | 0.005 |
| 997.0 | 0.001 |
| 996.0 | 0.008 |
| 995.0 | 0.025 |
| 994.0 | 0.005 |
| 993.0 | 0.006 |
| 992.0 | 0.006 |
| 991.0 | 0.001 |
| 990.0 | 0.023 |
| 989.0 | 0.015 |
| 988.0 | 0.003 |
| 987.0 | 0.004 |
| 986.0 | 0.005 |
| 985.0 | 0.026 |
| 984.0 | 0.007 |
| 983.0 | 0.003 |
| 982.0 | 0.003 |
| 981.0 | 0.022 |
| 980.0 | 0 |
| 979.0 | 0.007 |
| 978.0 | 0.002 |
| 977.0 | 0.025 |
| 976.0 | 0.014 |
| 975.0 | 0.003 |
| 974.0 | 0.019 |
| 973.0 | 0.007 |
| 972.0 | 0.001 |
| 971.0 | 0.008 |
| 970.0 | 0.032 |
| 969.0 | 0.01 |
| 968.0 | 0.004 |
| 967.0 | 0.002 |
| 966.0 | 0.002 |
| 965.0 | 0.003 |
| 964.0 | 0.026 |
| 963.0 | 0.024 |
| 962.0 | 0.009 |
| 961.0 | 0.026 |
| 960.0 | 0.002 |
| 959.0 | 0.029 |
| 958.0 | 0.026 |
| 957.0 | 0.003 |
| 956.0 | 0.024 |
| 955.0 | 0.001 |
| 954.0 | 0.024 |
| 953.0 | 0.005 |
| 952.0 | 0.004 |
| 951.0 | 0.018 |
| 950.0 | 0.002 |
| 949.0 | 0.018 |
| 948.0 | 0.004 |
| 947.0 | 0.036 |
| 946.0 | 0.037 |
| 945.0 | 0.005 |
| 944.0 | 0.003 |
| 943.0 | 0.005 |
| 942.0 | 0.001 |
| 941.0 | 0.008 |
| 940.0 | 0.024 |
| 939.0 | 0.006 |
| 938.0 | 0 |
| 937.0 | 0.003 |
| 936.0 | 0.016 |
| 935.0 | 0.002 |
| 934.0 | 0.007 |
| 933.0 | 0.012 |
| 932.0 | 0.027 |
| 931.0 | 0.026 |
| 930.0 | 0.001 |
| 929.0 | 0.009 |
| 928.0 | 0.001 |
| 927.0 | 0.023 |
| 926.0 | 0.021 |
| 925.0 | 0.003 |
| 924.0 | 0.007 |
| 923.0 | 0.004 |
| 922.0 | 0.004 |
| 921.0 | 0.018 |
| 920.0 | 0.007 |
| 919.0 | 0.003 |
| 918.0 | 0.005 |
| 917.0 | 0 |
| 916.0 | 0.008 |
| 915.0 | 0.019 |
| 914.0 | 0.011 |
| 913.0 | 0.013 |
| 912.0 | 0.019 |
| 911.0 | 0.004 |
| 910.0 | 0.005 |
| 909.0 | 0.002 |
| 908.0 | 0.001 |
| 907.0 | 0.003 |
| 906.0 | 0.005 |
| 905.0 | 0.007 |
| 904.0 | 0.012 |
| 903.0 | 0.004 |
| 902.0 | 0.002 |
| 901.0 | 0.011 |
| 900.0 | 0.027 |
| 899.0 | 0.01 |
| 898.0 | 0.001 |
| 897.0 | 0.005 |
| 896.0 | 0.002 |
| 895.0 | 0 |
| 894.0 | 0.013 |
| 893.0 | 0.038 |
| 892.0 | 0.025 |
| 891.0 | 0.005 |
| 890.0 | 0.005 |
| 889.0 | 0.001 |
| 888.0 | 0.001 |
| 887.0 | 0.006 |
| 886.0 | 0.011 |
| 885.0 | 0.014 |
| 884.0 | 0.017 |
| 883.0 | 0.004 |
| 882.0 | 0.001 |
| 881.0 | 0.003 |
| 880.0 | 0.007 |
| 879.0 | 0.011 |
| 878.0 | 0.005 |
| 877.0 | 0.002 |
| 876.0 | 0.007 |
| 875.0 | 0.021 |
| 874.0 | 0.012 |
| 873.0 | 0.005 |
| 872.0 | 0.008 |
| 871.0 | 0.005 |
| 870.0 | 0.002 |
| 869.0 | 0.002 |
| 868.0 | 0.017 |
| 867.0 | 0.023 |
| 866.0 | 0.013 |
| 865.0 | 0.004 |
| 864.0 | 0.001 |
| 863.0 | 0.003 |
| 862.0 | 0.004 |
| 861.0 | 0.004 |
| 860.0 | 0.007 |
| 859.0 | 0.006 |
| 858.0 | 0.006 |
| 857.0 | 0.004 |
| 856.0 | 0.003 |
| 855.0 | 0.002 |
| 854.0 | 0.005 |
| 853.0 | 0.003 |
| 852.0 | 0.002 |
| 851.0 | 0.004 |
| 850.0 | 0.002 |
| 849.0 | 0.002 |
| 848.0 | 0.005 |
| 847.0 | 0.006 |
| 846.0 | 0.005 |
| 845.0 | 0.006 |
| 844.0 | 0.004 |
| 843.0 | 0.004 |
| 842.0 | 0.003 |
| 841.0 | 0.002 |
| 840.0 | 0.005 |
| 839.0 | 0.004 |
| 838.0 | 0.003 |
| 837.0 | 0.006 |
| 836.0 | 0.005 |
| 835.0 | 0.005 |
| 834.0 | 0.005 |
| 833.0 | 0.005 |
| 832.0 | 0.005 |
| 831.0 | 0.005 |
| 830.0 | 0.003 |
| 829.0 | 0.004 |
| 828.0 | 0.005 |
| 827.0 | 0.007 |
| 826.0 | 0.007 |
| 825.0 | 0.006 |
| 824.0 | 0.003 |
| 823.0 | 0 |
| 822.0 | 0 |
| 821.0 | 0.003 |
| 820.0 | 0.008 |
| 819.0 | 0.009 |
| 818.0 | 0.006 |
| 817.0 | 0.004 |
| 816.0 | 0.004 |
| 815.0 | 0.003 |
| 814.0 | 0.002 |
| 813.0 | 0.006 |
| 812.0 | 0.004 |
| 811.0 | 0.002 |
| 810.0 | 0.002 |
| 809.0 | 0.003 |
| 808.0 | 0.003 |
| 807.0 | 0.003 |
| 806.0 | 0.003 |
| 805.0 | 0.004 |
| 804.0 | 0.004 |
| 803.0 | 0.004 |
| 802.0 | 0.005 |
| 801.0 | 0.004 |
| 800.0 | 0.003 |
| 799.0 | 0.004 |
| 798.0 | 0.004 |
| 797.0 | 0.004 |
| 796.0 | 0.004 |
| 795.0 | 0.004 |
| 794.0 | 0.004 |
| 793.0 | 0.004 |
| 792.0 | 0.004 |
| 791.0 | 0.004 |
| 790.0 | 0.005 |
| 789.0 | 0.004 |
| 788.0 | 0.004 |
| 787.0 | 0.004 |
| 786.0 | 0.004 |
| 785.0 | 0.004 |
| 784.0 | 0.004 |
| 783.0 | 0.004 |
| 782.0 | 0.003 |
| 781.0 | 0.005 |
| 780.0 | 0.016 |
| 779.0 | 0.042 |
| 778.0 | 0.059 |
| 777.0 | 0.056 |
| 776.0 | 0.063 |
| 775.0 | 0.076 |
| 774.0 | 0.094 |
| 773.0 | 0.116 |
| 772.0 | 0.116 |
| 771.0 | 0.117 |
| 770.0 | 0.136 |
| 769.0 | 0.189 |
| 768.0 | 0.227 |
| 767.0 | 0.244 |
| 766.0 | 0.299 |
| 765.0 | 0.294 |
| 764.0 | 0.279 |
| 763.0 | 0.275 |
| 762.0 | 0.283 |
| 761.0 | 0.299 |
| 760.0 | 0.289 |
| 759.0 | 0.293 |
| 758.0 | 0.297 |
| 757.0 | 0.285 |
| 756.0 | 0.31 |
| 755.0 | 0.349 |
| 754.0 | 0.4 |
| 753.0 | 0.463 |
| 752.0 | 0.503 |
| 751.0 | 0.538 |
| 750.0 | 0.586 |
| 749.0 | 0.652 |
| 748.0 | 0.701 |
| 747.0 | 0.734 |
| 746.0 | 0.75 |
| 745.0 | 0.745 |
| 744.0 | 0.74 |
| 743.0 | 0.727 |
| 742.0 | 0.766 |
| 741.0 | 0.859 |
| 740.0 | 0.976 |
| 739.0 | 1.06 |
| 738.0 | 1.068 |
| 737.0 | 1.075 |
| 736.0 | 1.136 |
| 735.0 | 1.215 |
| 734.0 | 1.256 |
| 733.0 | 1.285 |
| 732.0 | 1.409 |
| 731.0 | 1.57 |
| 730.0 | 1.55 |
| 729.0 | 1.464 |
| 728.0 | 1.523 |
| 727.0 | 1.742 |
| 726.0 | 1.969 |
| 725.0 | 2.118 |
| 724.0 | 2.303 |
| 723.0 | 2.461 |
| 722.0 | 2.634 |
| 721.0 | 2.961 |
| 720.0 | 3.359 |
| 719.0 | 3.75 |
| 718.0 | 4.209 |
| 717.0 | 4.858 |
| 716.0 | 4.574 |
| 715.0 | 4.416 |
| 714.0 | 4.481 |
| 713.0 | 4.717 |
| 712.0 | 4.256 |
| 711.0 | 4.318 |
| 710.0 | 4.693 |
| 709.0 | 4.3 |
| 708.0 | 4.54 |
| 707.0 | 4.892 |
| 706.0 | 4.256 |
| 705.0 | 4.359 |
| 704.0 | 4.215 |
| 703.0 | 4.494 |
| 702.0 | 4.716 |
| 701.0 | 4.971 |
| 700.0 | 4.308 |
| 699.0 | 4.403 |
| 698.0 | 4.308 |
| 697.0 | 4.439 |
| 696.0 | 4.795 |
| 695.0 | 4.825 |
| 694.0 | 4.223 |
| 693.0 | 4.358 |
| 692.0 | 4.207 |
| 691.0 | 4.272 |
| 690.0 | 4.74 |
| 689.0 | 4.357 |
| 688.0 | 4.263 |
| 687.0 | 4.263 |
| 686.0 | 4.298 |
| 685.0 | 4.465 |
| 684.0 | 4.479 |
| 683.0 | 5.125 |
| 682.0 | 4.157 |
| 681.0 | 4.254 |
| 680.0 | 4.221 |
| 679.0 | 4.39 |
| 678.0 | 4.765 |
| 677.0 | 4.555 |
| 676.0 | 4.199 |
| 675.0 | 4.413 |
| 674.0 | 4.124 |
| 673.0 | 4.316 |
| 672.0 | 4.438 |
| 671.0 | 4.739 |
| 670.0 | 4.143 |
| 669.0 | 4.27 |
| 668.0 | 4.261 |
| 667.0 | 4.589 |
| 666.0 | 4.507 |
| 665.0 | 4.928 |
| 664.0 | 4.184 |
| 663.0 | 4.253 |
| 662.0 | 4.236 |
| 661.0 | 4.253 |
| 660.0 | 4.646 |
| 659.0 | 4.537 |
| 658.0 | 4.162 |
| 657.0 | 4.228 |
| 656.0 | 4.149 |
| 655.0 | 4.236 |
| 654.0 | 4.506 |
| 653.0 | 4.69 |
| 652.0 | 4.278 |
| 651.0 | 4.212 |
| 650.0 | 4.228 |
| 649.0 | 4.228 |
| 648.0 | 4.822 |
| 647.0 | 4.506 |
| 646.0 | 4.26 |
| 645.0 | 4.26 |
| 644.0 | 4.129 |
| 643.0 | 4.168 |
| 642.0 | 4.689 |
| 641.0 | 4.423 |
| 640.0 | 4.252 |
| 639.0 | 4.122 |
| 638.0 | 4.26 |
| 637.0 | 4.277 |
| 636.0 | 4.666 |
| 635.0 | 4.505 |
| 634.0 | 4.334 |
| 633.0 | 4.196 |
| 632.0 | 4.219 |
| 631.0 | 4.204 |
| 630.0 | 4.888 |
| 629.0 | 4.365 |
| 628.0 | 4.268 |
| 627.0 | 4.259 |
| 626.0 | 4.333 |
| 625.0 | 4.154 |
| 624.0 | 4.624 |
| 623.0 | 4.387 |
| 622.0 | 4.203 |
| 621.0 | 4.211 |
| 620.0 | 4.242 |
| 619.0 | 4.16 |
| 618.0 | 4.586 |
| 617.0 | 4.333 |
| 616.0 | 4.226 |
| 615.0 | 4.234 |
| 614.0 | 4.25 |
| 613.0 | 4.267 |
| 612.0 | 4.624 |
| 611.0 | 4.551 |
| 610.0 | 4.259 |
| 609.0 | 4.127 |
| 608.0 | 4.115 |
| 607.0 | 4.195 |
| 606.0 | 4.504 |
| 605.0 | 4.461 |
| 604.0 | 4.188 |
| 603.0 | 4.233 |
| 602.0 | 4.166 |
| 601.0 | 4.233 |
| 600.0 | 4.551 |
| 599.0 | 4.447 |
| 598.0 | 4.188 |
| 597.0 | 4.275 |
| 596.0 | 4.353 |
| 595.0 | 4.241 |
| 594.0 | 4.46 |
| 593.0 | 4.434 |
| 592.0 | 4.195 |
| 591.0 | 4.166 |
| 590.0 | 4.139 |
| 589.0 | 4.249 |
| 588.0 | 4.488 |
| 587.0 | 4.664 |
| 586.0 | 4.202 |
| 585.0 | 4.249 |
| 584.0 | 4.266 |
| 583.0 | 4.217 |
| 582.0 | 4.474 |
| 581.0 | 4.533 |
| 580.0 | 4.194 |
| 579.0 | 4.145 |
| 578.0 | 4.138 |
| 577.0 | 4.302 |
| 576.0 | 4.42 |
| 575.0 | 4.473 |
| 574.0 | 4.113 |
| 573.0 | 4.145 |
| 572.0 | 4.132 |
| 571.0 | 4.265 |
| 570.0 | 4.502 |
| 569.0 | 4.517 |
| 568.0 | 4.193 |
| 567.0 | 4.208 |
| 566.0 | 4.32 |
| 565.0 | 4.24 |
| 564.0 | 4.487 |
| 563.0 | 4.445 |
| 562.0 | 4.158 |
| 561.0 | 4.187 |
| 560.0 | 4.194 |
| 559.0 | 4.275 |
| 558.0 | 4.152 |
| 557.0 | 4.293 |
| 556.0 | 4.567 |
| 555.0 | 4.446 |
| 554.0 | 4.152 |
| 553.0 | 4.311 |
| 552.0 | 4.283 |
| 551.0 | 4.363 |
| 550.0 | 4.473 |
| 549.0 | 4.362 |
| 548.0 | 4.132 |
| 547.0 | 4.172 |
| 546.0 | 4.144 |
| 545.0 | 4.24 |
| 544.0 | 4.408 |
| 543.0 | 4.331 |
| 542.0 | 4.151 |
| 541.0 | 4.208 |
| 540.0 | 4.185 |
| 539.0 | 4.24 |
| 538.0 | 4.487 |
| 537.0 | 4.373 |
| 536.0 | 4.171 |
| 535.0 | 4.15 |
| 534.0 | 4.124 |
| 533.0 | 4.223 |
| 532.0 | 4.516 |
| 531.0 | 4.383 |
| 530.0 | 4.215 |
| 529.0 | 4.171 |
| 528.0 | 4.137 |
| 527.0 | 4.23 |
| 526.0 | 4.5 |
| 525.0 | 4.3 |
| 524.0 | 4.13 |
| 523.0 | 4.149 |
| 522.0 | 4.199 |
| 521.0 | 4.309 |
| 520.0 | 4.6 |
| 519.0 | 4.418 |
| 518.0 | 4.6 |
| 517.0 | 4.281 |
| 516.0 | 3.858 |
| 515.0 | 3.872 |
| 514.0 | 4.012 |
| 513.0 | 4.338 |
| 512.0 | 4.847 |
| 511.0 | 4.581 |
| 510.0 | 3.718 |
| 509.0 | 2.903 |
| 508.0 | 2.361 |
| 507.0 | 2.096 |
| 506.0 | 2.066 |
| 505.0 | 2.214 |
| 504.0 | 2.293 |
| 503.0 | 2.143 |
| 502.0 | 2.073 |
| 501.0 | 2.2 |
| 500.0 | 2.484 |
| 499.0 | 2.685 |
| 498.0 | 2.528 |
| 497.0 | 2.331 |
| 496.0 | 2.275 |
| 495.0 | 2.356 |
| 494.0 | 2.538 |
| 493.0 | 2.788 |
| 492.0 | 3 |
| 491.0 | 3.043 |
| 490.0 | 2.839 |
| 489.0 | 2.434 |
| 488.0 | 2.157 |
| 487.0 | 2.099 |
| 486.0 | 2.195 |
| 485.0 | 2.205 |
| 484.0 | 2.095 |
| 483.0 | 2.099 |
| 482.0 | 2.168 |
| 481.0 | 2.066 |
| 480.0 | 1.937 |
| 479.0 | 1.971 |
| 478.0 | 2.144 |
| 477.0 | 2.18 |
| 476.0 | 1.911 |
| 475.0 | 1.639 |
| 474.0 | 1.498 |
| 473.0 | 1.478 |
| 472.0 | 1.478 |
| 471.0 | 1.379 |
| 470.0 | 1.272 |
| 469.0 | 1.3 |
| 468.0 | 1.517 |
| 467.0 | 1.834 |
| 466.0 | 1.889 |
| 465.0 | 1.708 |
| 464.0 | 1.562 |
| 463.0 | 1.515 |
| 462.0 | 1.553 |
| 461.0 | 1.642 |
| 460.0 | 1.772 |
| 459.0 | 1.945 |
| 458.0 | 2.207 |
| 457.0 | 2.597 |
| 456.0 | 2.889 |
| 455.0 | 2.926 |
| 454.0 | 3.046 |
| 453.0 | 3.426 |
| 452.0 | 4.809 |
| 451.0 | 4.222 |
| 450.0 | 4.23 |
| 449.0 | 4.523 |
| 448.0 | 5.353 |
| 447.0 | 4.523 |
| 446.0 | 4.321 |
| 445.0 | 4.273 |
| 444.0 | 4.229 |
| 443.0 | 4.374 |
| 442.0 | 4.491 |
| 441.0 | 4.205 |
| 440.0 | 4.147 |
| 439.0 | 4.237 |
| 438.0 | 4.16 |
| 437.0 | 4.34 |
| 436.0 | 4.63 |
| 435.0 | 4.309 |
| 434.0 | 4.204 |
| 433.0 | 4.219 |
| 432.0 | 4.126 |
| 431.0 | 4.395 |
| 430.0 | 4.59 |
| 429.0 | 4.349 |
| 428.0 | 4.298 |
| 427.0 | 4.307 |
| 426.0 | 4.279 |
| 425.0 | 5.951 |
| 424.0 | 3.643 |
| 423.0 | 3.326 |
| 422.0 | 3.437 |
| 421.0 | 3.954 |
| 420.0 | 4.406 |
| 419.0 | 3.829 |
| 418.0 | 2.818 |
| 417.0 | 2.522 |
| 416.0 | 2.601 |
| 415.0 | 2.92 |
| 414.0 | 3.201 |
| 413.0 | 3.202 |
| 412.0 | 3.029 |
| 411.0 | 2.934 |
| 410.0 | 3.105 |
| 409.0 | 3.212 |
| 408.0 | 3.028 |
| 407.0 | 3.034 |
| 406.0 | 3.278 |
| 405.0 | 3.431 |
| 404.0 | 3.367 |
| 403.0 | 3.335 |
| 402.0 | 2.674 |
| 401.0 | 2.302 |
| 400.0 | 2.129 |
| 399.0 | 2.112 |
| 398.0 | 2.293 |
| 397.0 | 2.657 |
| 396.0 | 2.881 |
| 395.0 | 2.897 |
| 394.0 | 2.867 |
| 393.0 | 2.303 |
| 392.0 | 1.998 |
| 391.0 | 2.012 |
| 390.0 | 2.141 |
| 389.0 | 2.145 |
| 388.0 | 2.193 |
| 387.0 | 2.234 |
| 386.0 | 1.899 |
| 385.0 | 1.588 |
| 384.0 | 1.477 |
| 383.0 | 1.505 |
| 382.0 | 1.639 |
| 381.0 | 1.899 |
| 380.0 | 1.904 |
| 379.0 | 1.614 |
| 378.0 | 1.367 |
| 377.0 | 1.255 |
| 376.0 | 1.314 |
| 375.0 | 1.562 |
| 374.0 | 1.934 |
| 373.0 | 2.307 |
| 372.0 | 2.739 |
| 371.0 | 3.365 |
| 370.0 | 4.596 |
| 369.0 | 4.792 |
| 368.0 | 4.576 |
| 367.0 | 5.461 |
| 366.0 | 5.239 |
| 365.0 | 4.324 |
| 364.0 | 4.393 |
| 363.0 | 4.255 |
| 362.0 | 4.229 |
| 361.0 | 4.522 |
| 360.0 | 4.635 |
| 359.0 | 4.264 |
| 358.0 | 4.228 |
| 357.0 | 4.367 |
| 356.0 | 4.302 |
| 355.0 | 4.458 |
| 354.0 | 4.656 |
| 353.0 | 4.202 |
| 352.0 | 4.186 |
| 351.0 | 4.343 |
| 350.0 | 4.262 |
| 349.0 | 4.519 |
| 348.0 | 4.788 |
| 347.0 | 4.218 |
| 346.0 | 4.243 |
| 345.0 | 4.134 |
| 344.0 | 4.299 |
| 343.0 | 4.414 |
| 342.0 | 4.677 |
| 341.0 | 4.192 |
| 340.0 | 4.147 |
| 339.0 | 4.363 |
| 338.0 | 4.259 |
| 337.0 | 4.44 |
| 336.0 | 4.727 |
| 335.0 | 4.168 |
| 334.0 | 4.215 |
| 333.0 | 4.167 |
| 332.0 | 4.268 |
| 331.0 | 4.651 |
| 330.0 | 4.608 |
| 329.0 | 4.248 |
| 328.0 | 4.151 |
| 327.0 | 4.549 |
| 326.0 | 4.338 |
| 325.0 | 4.567 |
| 324.0 | 4.481 |
| 323.0 | 4.221 |
| 322.0 | 4.165 |
| 321.0 | 4.513 |
| 320.0 | 4.229 |
| 319.0 | 4.605 |
| 318.0 | 4.235 |
| 317.0 | 4.217 |
| 316.0 | 4.406 |
| 315.0 | 4.225 |
| 314.0 | 4.301 |
| 313.0 | 4.81 |
| 312.0 | 4.844 |
| 311.0 | 4.332 |
| 310.0 | 4.251 |
| 309.0 | 4.198 |
| 308.0 | 4.32 |
| 307.0 | 4.746 |
| 306.0 | 4.746 |
| 305.0 | 4.309 |
| 304.0 | 4.288 |
| 303.0 | 4.458 |
| 302.0 | 4.297 |
| 301.0 | 4.598 |
| 300.0 | 4.92 |
| 299.0 | 4.329 |
| 298.0 | 4.257 |
| 297.0 | 4.328 |
| 296.0 | 4.317 |
| 295.0 | 4.597 |
| 294.0 | 5.317 |
| 293.0 | 4.256 |
| 292.0 | 4.284 |
| 291.0 | 4.503 |
| 290.0 | 4.264 |
| 289.0 | 4.713 |
| 288.0 | 5.139 |
| 287.0 | 4.192 |
| 286.0 | 4.244 |
| 285.0 | 4.123 |
| 284.0 | 4.292 |
| 283.0 | 4.573 |
| 282.0 | 4.961 |
| 281.0 | 4.191 |
| 280.0 | 4.271 |
| 279.0 | 4.198 |
| 278.0 | 4.129 |
| 277.0 | 4.613 |
| 276.0 | 5.215 |
| 275.0 | 4.158 |
| 274.0 | 4.241 |
| 273.0 | 4.189 |
| 272.0 | 4.29 |
| 271.0 | 4.834 |
| 270.0 | 4.766 |
| 269.0 | 4.196 |
| 268.0 | 4.156 |
| 267.0 | 4.514 |
| 266.0 | 4.55 |
| 265.0 | 5.009 |
| 264.0 | 4.766 |
| 263.0 | 4.221 |
| 262.0 | 4.156 |
| 261.0 | 4.434 |
| 260.0 | 4.14 |
| 259.0 | 4.735 |
| 258.0 | 4.496 |
| 257.0 | 4.229 |
| 256.0 | 4.139 |
| 255.0 | 4.404 |
| 254.0 | 4.169 |
| 253.0 | 4.909 |
| 252.0 | 4.477 |
| 251.0 | 4.295 |
| 250.0 | 4.152 |
| 249.0 | 4.585 |
| 248.0 | 4.094 |
| 247.0 | 4.73 |
| 246.0 | 4.627 |
| 245.0 | 4.243 |
| 244.0 | 4.19 |
| 243.0 | 4.206 |
| 242.0 | 4.165 |
| 241.0 | 5.06 |
| 240.0 | 4.362 |
| 239.0 | 4.243 |
| 238.0 | 4.067 |
| 237.0 | 4.563 |
| 236.0 | 4.086 |
| 235.0 | 4.759 |
| 234.0 | 4.508 |
| 233.0 | 4.134 |
| 232.0 | 4.141 |
| 231.0 | 4.427 |
| 230.0 | 4.126 |
| 229.0 | 4.824 |
| 228.0 | 4.561 |
| 227.0 | 4.17 |
| 226.0 | 4.161 |
| 225.0 | 4.168 |
| 224.0 | 4.21 |
| 223.0 | 4.644 |
| 222.0 | 4.436 |
| 221.0 | 4.149 |
| 220.0 | 4.111 |
| 219.0 | 4.283 |
| 218.0 | 4.187 |
| 217.0 | 4.552 |
| 216.0 | 4.416 |
| 215.0 | 4.107 |
| 214.0 | 4.121 |
| 213.0 | 4.027 |
| 212.0 | 4.174 |
| 211.0 | 4.31 |
| 210.0 | 4.344 |
| 209.0 | 4.075 |
| 208.0 | 4.08 |
| 207.0 | 4.214 |
| 206.0 | 4.122 |
| 205.0 | 4.222 |
| 204.0 | 4.221 |
| 203.0 | 3.914 |
| 202.0 | 3.909 |
| 201.0 | 3.832 |
| 200.0 | 3.867 |